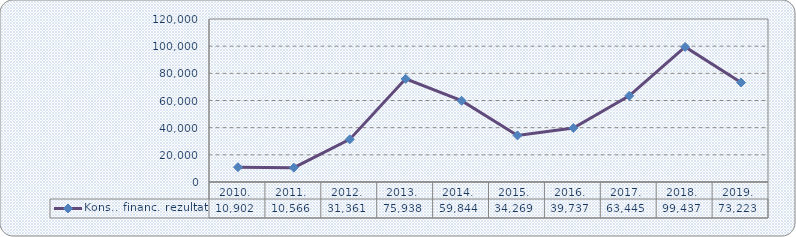
| Category | Kons.. financ. rezultat |
|---|---|
| 2010. | 10902 |
| 2011. | 10566 |
| 2012. | 31361 |
| 2013. | 75938 |
| 2014. | 59844 |
| 2015. | 34268.649 |
| 2016. | 39737.247 |
| 2017. | 63444.768 |
| 2018. | 99437.322 |
| 2019. | 73223.312 |